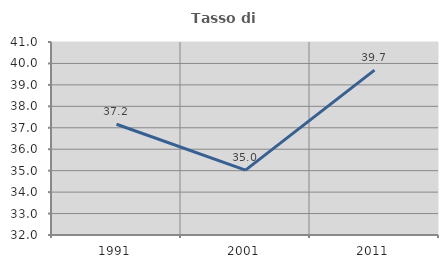
| Category | Tasso di occupazione   |
|---|---|
| 1991.0 | 37.165 |
| 2001.0 | 35.023 |
| 2011.0 | 39.691 |